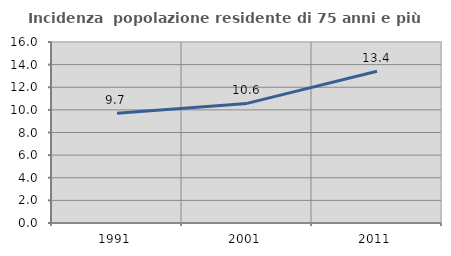
| Category | Incidenza  popolazione residente di 75 anni e più |
|---|---|
| 1991.0 | 9.707 |
| 2001.0 | 10.572 |
| 2011.0 | 13.414 |